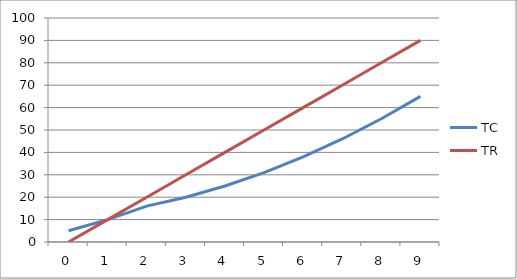
| Category | TC | TR |
|---|---|---|
| 0.0 | 5 | 0 |
| 1.0 | 10 | 10 |
| 2.0 | 16 | 20 |
| 3.0 | 20 | 30 |
| 4.0 | 25 | 40 |
| 5.0 | 31 | 50 |
| 6.0 | 38 | 60 |
| 7.0 | 46 | 70 |
| 8.0 | 55 | 80 |
| 9.0 | 65 | 90 |